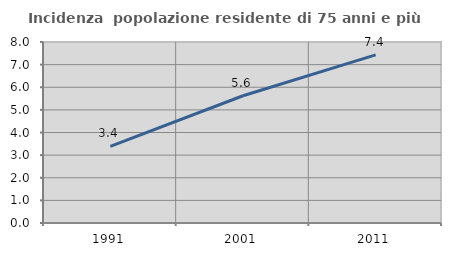
| Category | Incidenza  popolazione residente di 75 anni e più |
|---|---|
| 1991.0 | 3.386 |
| 2001.0 | 5.623 |
| 2011.0 | 7.431 |